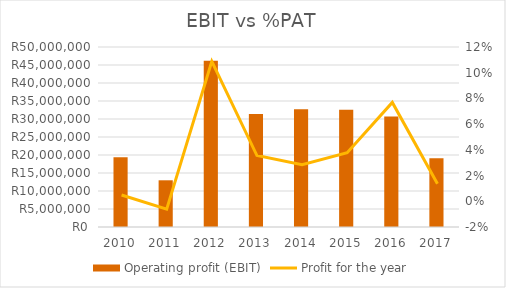
| Category | Operating profit (EBIT) |
|---|---|
| 2010.0 | 19356456 |
| 2011.0 | 12971980 |
| 2012.0 | 46170888 |
| 2013.0 | 31405035 |
| 2014.0 | 32716841 |
| 2015.0 | 32570808 |
| 2016.0 | 30671614 |
| 2017.0 | 19071649 |